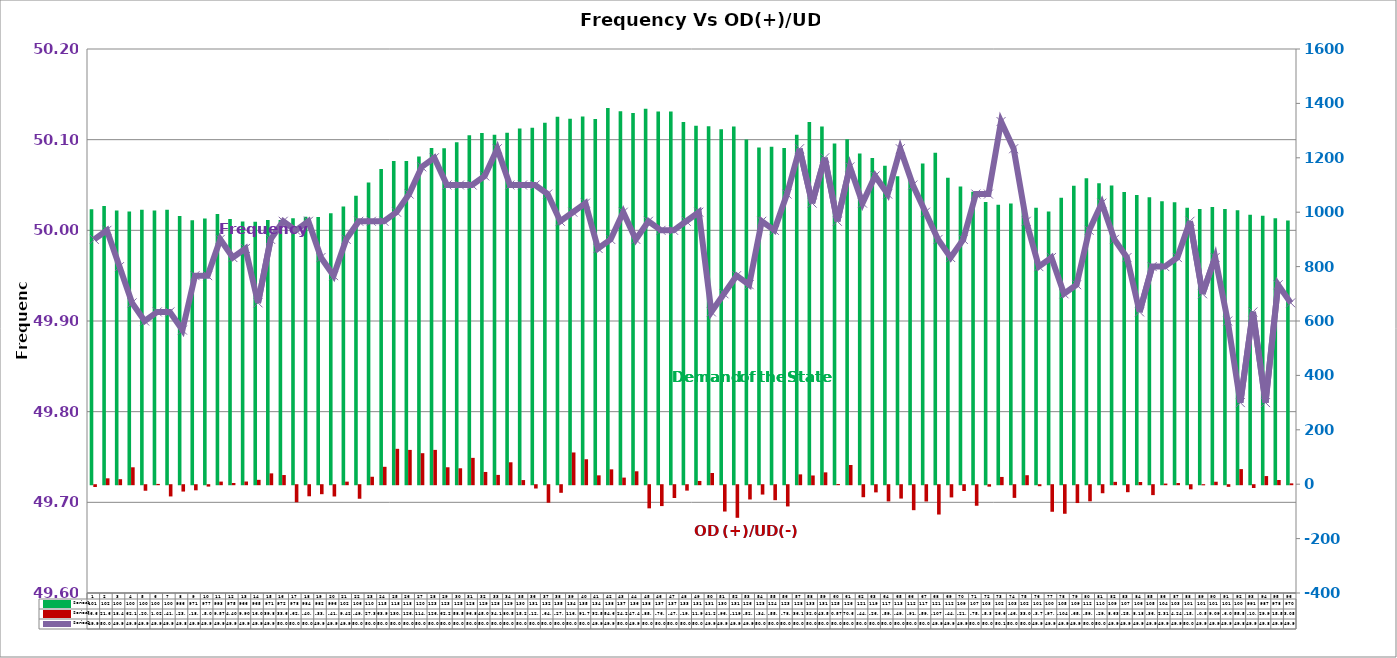
| Category | Series 2 | Series 4 |
|---|---|---|
| 0 | 1011.09 | -6.6 |
| 1 | 1022.89 | 21.63 |
| 2 | 1006.6 | 18.42 |
| 3 | 1002.79 | 62.16 |
| 4 | 1008.76 | -20.35 |
| 5 | 1005.92 | 1.02 |
| 6 | 1009.33 | -41.32 |
| 7 | 986.02 | -23.38 |
| 8 | 970.82 | -18.82 |
| 9 | 977.17 | -5.09 |
| 10 | 993.08 | 9.57 |
| 11 | 975.23 | 4.4 |
| 12 | 965.85 | 9.9 |
| 13 | 965.21 | 16.09 |
| 14 | 970.93 | 39.83 |
| 15 | 971.69 | 33.66 |
| 16 | 977.72 | -62.62 |
| 17 | 983.69 | -40.75 |
| 18 | 982.21 | -33.08 |
| 19 | 996.26 | -41.47 |
| 20 | 1020.82 | 9.42 |
| 21 | 1060.29 | -49.84 |
| 22 | 1108.81 | 27.36 |
| 23 | 1158.89 | 63.96 |
| 24 | 1188.38 | 130.1 |
| 25 | 1188.11 | 126.07 |
| 26 | 1204.43 | 114 |
| 27 | 1236.34 | 126.16 |
| 28 | 1234.7 | 62.26 |
| 29 | 1256.72 | 58.52 |
| 30 | 1282.92 | 96.83 |
| 31 | 1291.41 | 45.04 |
| 32 | 1284.6 | 34.17 |
| 33 | 1292.11 | 80.57 |
| 34 | 1307.44 | 15.2 |
| 35 | 1310.56 | -12.14 |
| 36 | 1328.74 | -64.46 |
| 37 | 1351.18 | -27.95 |
| 38 | 1343.52 | 116.66 |
| 39 | 1352.12 | 91.73 |
| 40 | 1342.19 | 32.58 |
| 41 | 1382.93 | 54.64 |
| 42 | 1370.93 | 24.28 |
| 43 | 1364.55 | 47.49 |
| 44 | 1379.88 | -85.12 |
| 45 | 1370.08 | -76.78 |
| 46 | 1369.9 | -47.11 |
| 47 | 1331.22 | -19.94 |
| 48 | 1317.8 | 11.98 |
| 49 | 1315.66 | 41.27 |
| 50 | 1305.22 | -96.8 |
| 51 | 1315.38 | -119.84 |
| 52 | 1267.26 | -52.49 |
| 53 | 1238.13 | -34.41 |
| 54 | 1240.33 | -55.07 |
| 55 | 1236.37 | -78.07 |
| 56 | 1284.997 | 36.14 |
| 57 | 1331.37 | 32.06 |
| 58 | 1315.037 | 43.56 |
| 59 | 1252.69 | 0.57 |
| 60 | 1267.85 | 70.62 |
| 61 | 1215.47 | -44.15 |
| 62 | 1198.91 | -26.45 |
| 63 | 1170.46 | -59.59 |
| 64 | 1132.59 | -49.15 |
| 65 | 1128.24 | -91.84 |
| 66 | 1178.657 | -59.87 |
| 67 | 1218.643 | -107.83 |
| 68 | 1126.5 | -44.89 |
| 69 | 1094.71 | -21.21 |
| 70 | 1074.73 | -75.61 |
| 71 | 1037.91 | -5.35 |
| 72 | 1027.68 | 26.69 |
| 73 | 1031.83 | -46.62 |
| 74 | 1026.56 | 33.05 |
| 75 | 1016.16 | -3.73 |
| 76 | 1002.13 | -97.65 |
| 77 | 1053.43 | -104.99 |
| 78 | 1097.16 | -65.59 |
| 79 | 1124.58 | -59.21 |
| 80 | 1106.05 | -29.56 |
| 81 | 1097.75 | 8.63 |
| 82 | 1073.99 | -25.75 |
| 83 | 1062.97 | 8.18 |
| 84 | 1054.99 | -36.45 |
| 85 | 1040.24 | 2.31 |
| 86 | 1036.53 | 4.24 |
| 87 | 1016.61 | -15.21 |
| 88 | 1011.61 | -0.56 |
| 89 | 1018.96 | 9.09 |
| 90 | 1012.12 | -6 |
| 91 | 1007.49 | 55.53 |
| 92 | 990.59 | -10.3 |
| 93 | 986.62 | 29.95 |
| 94 | 978.01 | 15.5 |
| 95 | 969.86 | 3.05 |